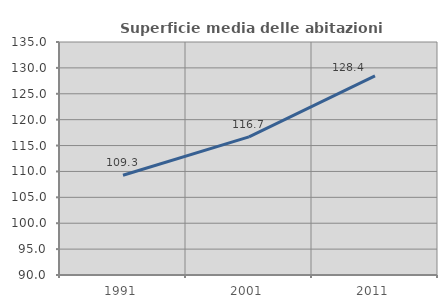
| Category | Superficie media delle abitazioni occupate |
|---|---|
| 1991.0 | 109.262 |
| 2001.0 | 116.684 |
| 2011.0 | 128.445 |